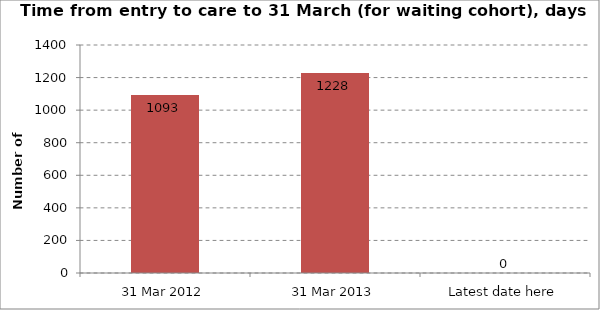
| Category | Children with a decision waiting to be placed |
|---|---|
| 31 Mar 2012 | 1093 |
| 31 Mar 2013 | 1228 |
| Latest date here | 0 |